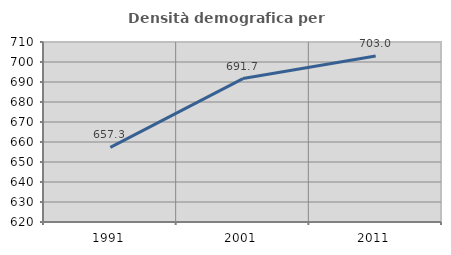
| Category | Densità demografica |
|---|---|
| 1991.0 | 657.287 |
| 2001.0 | 691.714 |
| 2011.0 | 702.957 |